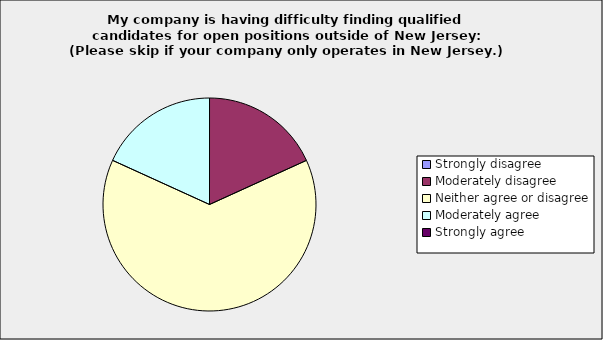
| Category | Series 0 |
|---|---|
| Strongly disagree | 0 |
| Moderately disagree | 0.182 |
| Neither agree or disagree | 0.636 |
| Moderately agree | 0.182 |
| Strongly agree | 0 |